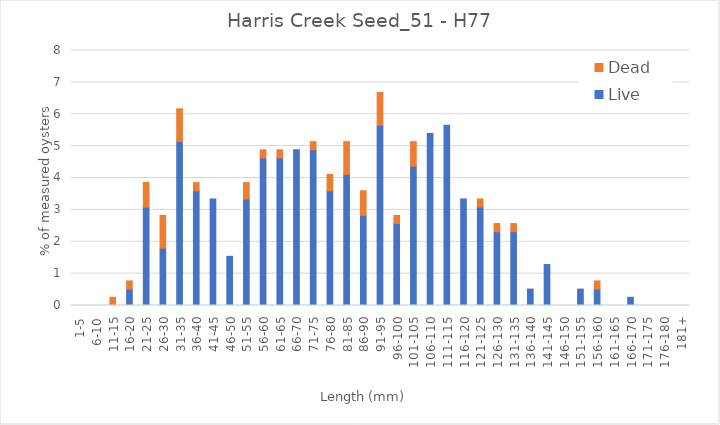
| Category | Live | Dead |
|---|---|---|
| 1-5 | 0 | 0 |
| 6-10 | 0 | 0 |
| 11-15 | 0 | 0.257 |
| 16-20 | 0.514 | 0.257 |
| 21-25 | 3.085 | 0.771 |
| 26-30 | 1.799 | 1.028 |
| 31-35 | 5.141 | 1.028 |
| 36-40 | 3.599 | 0.257 |
| 41-45 | 3.342 | 0 |
| 46-50 | 1.542 | 0 |
| 51-55 | 3.342 | 0.514 |
| 56-60 | 4.627 | 0.257 |
| 61-65 | 4.627 | 0.257 |
| 66-70 | 4.884 | 0 |
| 71-75 | 4.884 | 0.257 |
| 76-80 | 3.599 | 0.514 |
| 81-85 | 4.113 | 1.028 |
| 86-90 | 2.828 | 0.771 |
| 91-95 | 5.656 | 1.028 |
| 96-100 | 2.571 | 0.257 |
| 101-105 | 4.37 | 0.771 |
| 106-110 | 5.398 | 0 |
| 111-115 | 5.656 | 0 |
| 116-120 | 3.342 | 0 |
| 121-125 | 3.085 | 0.257 |
| 126-130 | 2.314 | 0.257 |
| 131-135 | 2.314 | 0.257 |
| 136-140 | 0.514 | 0 |
| 141-145 | 1.285 | 0 |
| 146-150 | 0 | 0 |
| 151-155 | 0.514 | 0 |
| 156-160 | 0.514 | 0.257 |
| 161-165 | 0 | 0 |
| 166-170 | 0.257 | 0 |
| 171-175 | 0 | 0 |
| 176-180 | 0 | 0 |
| 181+ | 0 | 0 |